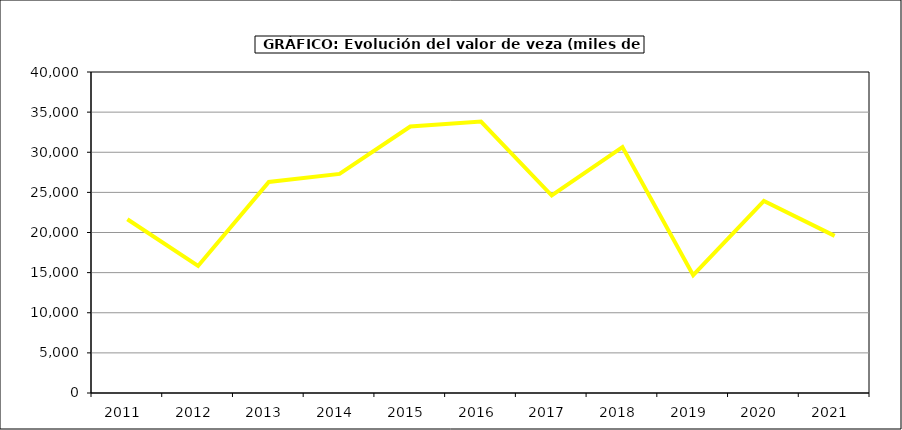
| Category | Valor |
|---|---|
| 2011.0 | 21651.853 |
| 2012.0 | 15834 |
| 2013.0 | 26306.52 |
| 2014.0 | 27301.452 |
| 2015.0 | 33211 |
| 2016.0 | 33824 |
| 2017.0 | 24609.102 |
| 2018.0 | 30638.594 |
| 2019.0 | 14686.227 |
| 2020.0 | 23930.599 |
| 2021.0 | 19579.587 |